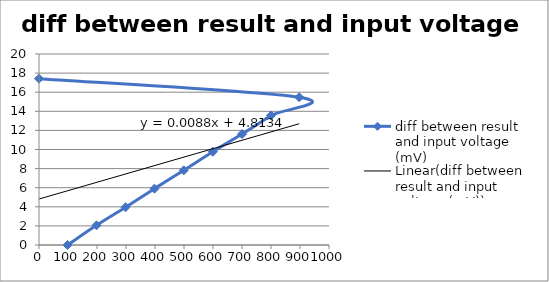
| Category | diff between result and input voltage (mV) |
|---|---|
| 98.44 | 0 |
| 198.25 | 2.064 |
| 298.39 | 3.955 |
| 398.17 | 5.901 |
| 499.39 | 7.824 |
| 599.3 | 9.767 |
| 700.0 | 11.619 |
| 799.9 | 13.562 |
| 897.4 | 15.471 |